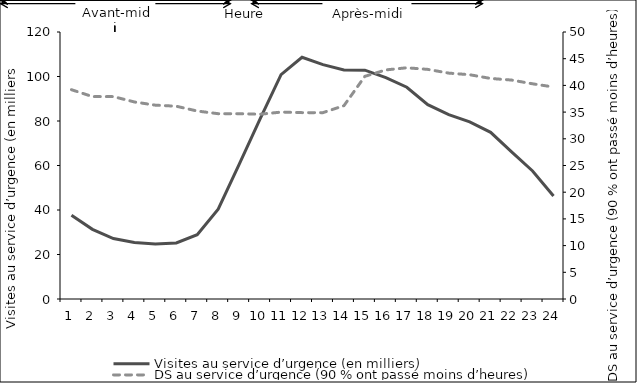
| Category | Visites au service d’urgence (en milliers) |
|---|---|
| 0 | 37.653 |
| 1 | 31.296 |
| 2 | 27.187 |
| 3 | 25.374 |
| 4 | 24.721 |
| 5 | 25.186 |
| 6 | 28.902 |
| 7 | 40.38 |
| 8 | 60.511 |
| 9 | 81.007 |
| 10 | 100.859 |
| 11 | 108.648 |
| 12 | 105.322 |
| 13 | 102.888 |
| 14 | 102.838 |
| 15 | 99.525 |
| 16 | 95.18 |
| 17 | 87.314 |
| 18 | 82.839 |
| 19 | 79.596 |
| 20 | 74.899 |
| 21 | 66.134 |
| 22 | 57.562 |
| 23 | 46.27 |